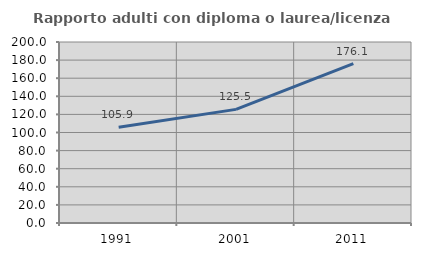
| Category | Rapporto adulti con diploma o laurea/licenza media  |
|---|---|
| 1991.0 | 105.856 |
| 2001.0 | 125.54 |
| 2011.0 | 176.119 |